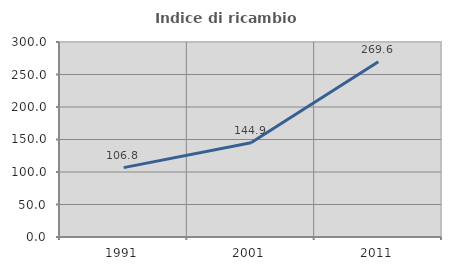
| Category | Indice di ricambio occupazionale  |
|---|---|
| 1991.0 | 106.757 |
| 2001.0 | 144.935 |
| 2011.0 | 269.604 |